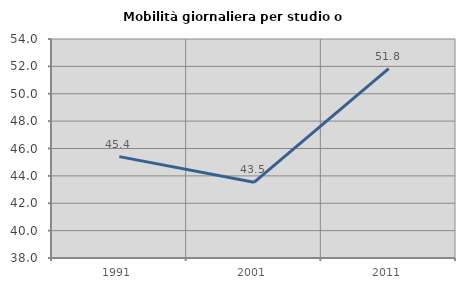
| Category | Mobilità giornaliera per studio o lavoro |
|---|---|
| 1991.0 | 45.408 |
| 2001.0 | 43.533 |
| 2011.0 | 51.835 |